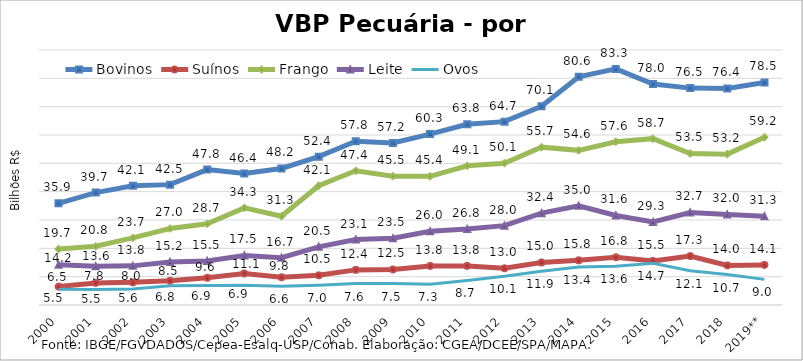
| Category | Bovinos | Suínos | Frango | Leite | Ovos |
|---|---|---|---|---|---|
| 2000 | 35.882 | 6.497 | 19.744 | 14.173 | 5.542 |
| 2001 | 39.664 | 7.795 | 20.753 | 13.638 | 5.461 |
| 2002 | 42.091 | 7.989 | 23.688 | 13.81 | 5.626 |
| 2003 | 42.481 | 8.538 | 27.007 | 15.208 | 6.805 |
| 2004 | 47.796 | 9.599 | 28.678 | 15.543 | 6.897 |
| 2005 | 46.403 | 11.13 | 34.286 | 17.481 | 6.944 |
| 2006 | 48.178 | 9.79 | 31.322 | 16.698 | 6.596 |
| 2007 | 52.358 | 10.469 | 42.084 | 20.527 | 7.01 |
| 2008 | 57.809 | 12.396 | 47.373 | 23.092 | 7.571 |
| 2009 | 57.206 | 12.53 | 45.484 | 23.543 | 7.549 |
| 2010 | 60.313 | 13.785 | 45.429 | 26 | 7.342 |
| 2011 | 63.76 | 13.806 | 49.134 | 26.803 | 8.652 |
| 2012 | 64.71 | 12.963 | 50.051 | 28.008 | 10.142 |
| 2013 | 70.123 | 15.01 | 55.708 | 32.41 | 11.928 |
| 2014 | 80.559 | 15.765 | 54.581 | 34.999 | 13.402 |
| 2015 | 83.331 | 16.848 | 57.62 | 31.593 | 13.646 |
| 2016 | 78.002 | 15.548 | 58.711 | 29.314 | 14.711 |
| 2017 | 76.545 | 17.26 | 53.476 | 32.662 | 12.126 |
| 2018 | 76.416 | 13.98 | 53.246 | 31.966 | 10.737 |
| 2019** | 78.543 | 14.146 | 59.207 | 31.299 | 9.046 |